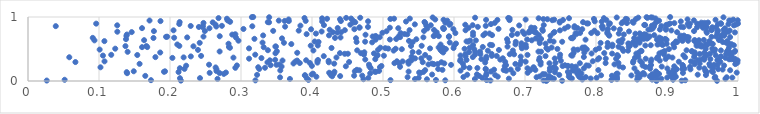
| Category | Series 0 |
|---|---|
| 0.7299349012485046 | 0.001 |
| 0.8851271148801086 | 0.002 |
| 0.9704446892895401 | 0.003 |
| 0.7522630521465085 | 0.004 |
| 0.9206481380586479 | 0.005 |
| 0.21533558743434872 | 0.006 |
| 0.026396326933418108 | 0.007 |
| 0.6513391772368835 | 0.008 |
| 0.7260594738416578 | 0.009 |
| 0.3202966401967571 | 0.01 |
| 0.5876682141787407 | 0.011 |
| 0.9257274416154958 | 0.012 |
| 0.17321469520273655 | 0.013 |
| 0.5105476472318626 | 0.014 |
| 0.645893604904842 | 0.015 |
| 0.5745877451959991 | 0.016 |
| 0.3949700723018088 | 0.017 |
| 0.8217753047264127 | 0.018 |
| 0.05161715156054727 | 0.019 |
| 0.9085060905664327 | 0.02 |
| 0.7317237979715445 | 0.021 |
| 0.8790770480540634 | 0.022 |
| 0.8580503356786545 | 0.023 |
| 0.7807825853209398 | 0.024 |
| 0.8867679921875168 | 0.025 |
| 0.7326063486481591 | 0.026 |
| 0.5618832442880827 | 0.027 |
| 0.47247400463420625 | 0.028 |
| 0.8295293481066721 | 0.029 |
| 0.5450958506525477 | 0.03 |
| 0.6294409682373789 | 0.031 |
| 0.3688950731030703 | 0.032 |
| 0.2669262019391956 | 0.033 |
| 0.8920140134834883 | 0.034 |
| 0.9823404318936501 | 0.035 |
| 0.740705699769862 | 0.036 |
| 0.677277720533834 | 0.037 |
| 0.7384435290794494 | 0.038 |
| 0.7925464789705889 | 0.039 |
| 0.7659609976045109 | 0.04 |
| 0.39270856272770227 | 0.041 |
| 0.8293403634217462 | 0.042 |
| 0.7812152879152522 | 0.043 |
| 0.21403520343330038 | 0.044 |
| 0.242246551091688 | 0.045 |
| 0.823674644437959 | 0.046 |
| 0.4792924608670494 | 0.047 |
| 0.6400161262003763 | 0.048 |
| 0.5502416499443968 | 0.049 |
| 0.8008211047687481 | 0.05 |
| 0.9671763706332107 | 0.051 |
| 0.7634456688116622 | 0.052 |
| 0.9920200841988499 | 0.053 |
| 0.9003204524386306 | 0.054 |
| 0.8611626668766535 | 0.055 |
| 0.7365337659491814 | 0.056 |
| 0.35503866398495726 | 0.057 |
| 0.9840582868963575 | 0.058 |
| 0.716318172759799 | 0.059 |
| 0.5346271771457493 | 0.06 |
| 0.7855856252759781 | 0.061 |
| 0.6132854470898765 | 0.062 |
| 0.7765765593028493 | 0.063 |
| 0.9679195542465351 | 0.064 |
| 0.9124521409534563 | 0.065 |
| 0.8294656088526974 | 0.066 |
| 0.40616311862784593 | 0.067 |
| 0.6616033069328324 | 0.068 |
| 0.7616928018792335 | 0.069 |
| 0.8585446357150388 | 0.07 |
| 0.8817077016365238 | 0.071 |
| 0.7207046953120136 | 0.072 |
| 0.8757414568585552 | 0.073 |
| 0.4283971444868982 | 0.074 |
| 0.7336017351095295 | 0.075 |
| 0.9114039719682651 | 0.076 |
| 0.4396665985323711 | 0.077 |
| 0.9056146824722616 | 0.078 |
| 0.6354101182015974 | 0.079 |
| 0.16519122051671808 | 0.08 |
| 0.9060413542827915 | 0.081 |
| 0.8225126723208137 | 0.082 |
| 0.4593364482381973 | 0.083 |
| 0.4707683890769927 | 0.084 |
| 0.7754020137651354 | 0.085 |
| 0.39055841115971873 | 0.086 |
| 0.8498432928704529 | 0.087 |
| 0.8857245384539948 | 0.088 |
| 0.8071369981865455 | 0.089 |
| 0.3899050201608162 | 0.09 |
| 0.6452632197534787 | 0.091 |
| 0.6580543698401828 | 0.092 |
| 0.9548141869132833 | 0.093 |
| 0.8787468571465591 | 0.094 |
| 0.7482520825225147 | 0.095 |
| 0.3226523432572018 | 0.096 |
| 0.426251314059735 | 0.097 |
| 0.6186308977875078 | 0.098 |
| 0.9432494454380806 | 0.099 |
| 0.8633617228847603 | 0.1 |
| 0.5692149259976328 | 0.101 |
| 0.399538127508098 | 0.102 |
| 0.8682703561659177 | 0.103 |
| 0.632310771430195 | 0.104 |
| 0.7280650453602969 | 0.105 |
| 0.4280295866738755 | 0.106 |
| 0.7251732574341322 | 0.107 |
| 0.879586658403317 | 0.108 |
| 0.7621104085858508 | 0.109 |
| 0.888797389631854 | 0.11 |
| 0.2758568390336391 | 0.111 |
| 0.8288372902590145 | 0.112 |
| 0.6457026406960731 | 0.113 |
| 0.40153956028942034 | 0.114 |
| 0.4306250741459417 | 0.115 |
| 0.8303071496463488 | 0.116 |
| 0.9102976181771898 | 0.117 |
| 0.7735892633275299 | 0.118 |
| 0.48195459948296643 | 0.119 |
| 0.779418482987507 | 0.12 |
| 0.6835557311774909 | 0.121 |
| 0.1395963485331204 | 0.122 |
| 0.2699761393912408 | 0.123 |
| 0.552522140016754 | 0.124 |
| 0.8665219889888859 | 0.125 |
| 0.922454421027908 | 0.126 |
| 0.2558834430971773 | 0.127 |
| 0.7037642814637972 | 0.128 |
| 0.42419358575693805 | 0.129 |
| 0.8859439583607438 | 0.13 |
| 0.9982000404380343 | 0.131 |
| 0.2787594572602362 | 0.132 |
| 0.5509227740310202 | 0.133 |
| 0.9557460459843845 | 0.134 |
| 0.9029450129447684 | 0.135 |
| 0.8578692040038169 | 0.136 |
| 0.7421848299285334 | 0.137 |
| 0.13902724682314754 | 0.138 |
| 0.9646508094372324 | 0.139 |
| 0.21204681032111702 | 0.14 |
| 0.5568887717798795 | 0.141 |
| 0.7604099413243516 | 0.142 |
| 0.4899129353735981 | 0.143 |
| 0.19152677247977284 | 0.144 |
| 0.43160581567873374 | 0.145 |
| 0.4884362994657613 | 0.146 |
| 0.536060970602131 | 0.147 |
| 0.6521857390019967 | 0.148 |
| 0.9089208796446411 | 0.149 |
| 0.8844055195411262 | 0.15 |
| 0.19299956908962046 | 0.151 |
| 0.1489348578616638 | 0.152 |
| 0.46032527454876626 | 0.153 |
| 0.9543114705460127 | 0.154 |
| 0.26549379586839655 | 0.155 |
| 0.9632539174173742 | 0.156 |
| 0.49444015525194146 | 0.157 |
| 0.7348004174487233 | 0.158 |
| 0.9543734406239085 | 0.159 |
| 0.7754701536575848 | 0.16 |
| 0.673752986138464 | 0.161 |
| 0.6092252808924444 | 0.162 |
| 0.7692983831820039 | 0.163 |
| 0.7668516608950096 | 0.164 |
| 0.35535463365680287 | 0.165 |
| 0.6723346508877919 | 0.166 |
| 0.4667228076091737 | 0.167 |
| 0.9889481622046089 | 0.168 |
| 0.7073626008594448 | 0.169 |
| 0.5594073512560157 | 0.17 |
| 0.8033089394796823 | 0.171 |
| 0.6700101581189098 | 0.172 |
| 0.7146028627760007 | 0.173 |
| 0.5837285530246301 | 0.174 |
| 0.46316941499904724 | 0.175 |
| 0.9091792256002911 | 0.176 |
| 0.6564362487742954 | 0.177 |
| 0.679860831337899 | 0.178 |
| 0.9783150435138863 | 0.179 |
| 0.26553357391323856 | 0.18 |
| 0.6447518275023574 | 0.181 |
| 0.9330069389213855 | 0.182 |
| 0.9135226526418838 | 0.183 |
| 0.9131437837940745 | 0.184 |
| 0.9720632677297083 | 0.185 |
| 0.9216642879680884 | 0.186 |
| 0.5777583974567733 | 0.187 |
| 0.32567367541740044 | 0.188 |
| 0.22038265762099093 | 0.189 |
| 0.6899128919758631 | 0.19 |
| 0.6445877059345456 | 0.191 |
| 0.8762765896607497 | 0.192 |
| 0.9245884243301037 | 0.193 |
| 0.7433996357024932 | 0.194 |
| 0.9005407479932556 | 0.195 |
| 0.9526851837386793 | 0.196 |
| 0.8541810626103278 | 0.197 |
| 0.7829065965119275 | 0.198 |
| 0.703564439801954 | 0.199 |
| 0.2139024808483259 | 0.2 |
| 0.7350872767028662 | 0.201 |
| 0.48266640304549735 | 0.202 |
| 0.6329361904369978 | 0.203 |
| 0.9649103463272508 | 0.204 |
| 0.621781160498361 | 0.205 |
| 0.2920124896675076 | 0.206 |
| 0.3338077493198002 | 0.207 |
| 0.7392789509276836 | 0.208 |
| 0.945502275553658 | 0.209 |
| 0.7121499635142886 | 0.21 |
| 0.8380428278899719 | 0.211 |
| 0.264283401639155 | 0.212 |
| 0.7120157224099088 | 0.213 |
| 0.10210518187968552 | 0.214 |
| 0.3242863908376798 | 0.215 |
| 0.49570513254337184 | 0.216 |
| 0.7414301301821857 | 0.217 |
| 0.6140531197021679 | 0.218 |
| 0.8696436997761189 | 0.219 |
| 0.922371414094233 | 0.22 |
| 0.9324761193262175 | 0.221 |
| 0.5240443324520808 | 0.222 |
| 0.8752970354976021 | 0.223 |
| 0.7715800381226685 | 0.224 |
| 0.8925976723867168 | 0.225 |
| 0.3571778530350089 | 0.226 |
| 0.4808708894969146 | 0.227 |
| 0.8329210235834568 | 0.228 |
| 0.9102116968895143 | 0.229 |
| 0.44765865101635544 | 0.23 |
| 0.7659349328918965 | 0.231 |
| 0.7604660703924303 | 0.232 |
| 0.6714570872303623 | 0.233 |
| 0.752900612482865 | 0.234 |
| 0.4978090354150115 | 0.235 |
| 0.39985060045669013 | 0.236 |
| 0.760444528823898 | 0.237 |
| 0.9605563549278331 | 0.238 |
| 0.22274959227623506 | 0.239 |
| 0.789787915995208 | 0.24 |
| 0.8656361788145678 | 0.241 |
| 0.9804140988451003 | 0.242 |
| 0.29423051753853996 | 0.243 |
| 0.7865090435358865 | 0.244 |
| 0.9222621246026126 | 0.245 |
| 0.7562938094465922 | 0.246 |
| 0.34176089383824115 | 0.247 |
| 0.6733163239055092 | 0.248 |
| 0.9217098832584106 | 0.249 |
| 0.8774934506588892 | 0.25 |
| 0.9711779924695619 | 0.251 |
| 0.5958604692592331 | 0.252 |
| 0.3499971239187729 | 0.253 |
| 0.9663482584339351 | 0.254 |
| 0.25499651727447464 | 0.255 |
| 0.4802844433443474 | 0.256 |
| 0.3543198186834152 | 0.257 |
| 0.721974701744977 | 0.258 |
| 0.564052724848175 | 0.259 |
| 0.8260316411721247 | 0.26 |
| 0.6929071415601735 | 0.261 |
| 0.9389673108541178 | 0.262 |
| 0.5717758500773974 | 0.263 |
| 0.996197251042208 | 0.264 |
| 0.5770202696448848 | 0.265 |
| 0.9597224147629014 | 0.266 |
| 0.6864445240796546 | 0.267 |
| 0.15717666585883144 | 0.268 |
| 0.6125648865352379 | 0.269 |
| 0.5360196501574012 | 0.27 |
| 0.4312654907846526 | 0.271 |
| 0.5690000106019761 | 0.272 |
| 0.9460233962198503 | 0.273 |
| 0.37390473742013497 | 0.274 |
| 0.5863509873978577 | 0.275 |
| 0.5226775743643451 | 0.276 |
| 0.734444362343775 | 0.277 |
| 0.7772499596229323 | 0.278 |
| 0.5160758800640529 | 0.279 |
| 0.8135352141266116 | 0.28 |
| 0.38276951081654725 | 0.281 |
| 0.8316078325340994 | 0.282 |
| 0.3969322018445183 | 0.283 |
| 0.7429186106753989 | 0.284 |
| 0.9991284606617038 | 0.285 |
| 0.8646463055684872 | 0.286 |
| 0.407668732881717 | 0.287 |
| 0.8521516388065578 | 0.288 |
| 0.6439271842378989 | 0.289 |
| 0.9386424394934456 | 0.29 |
| 0.33727827619289197 | 0.291 |
| 0.42363934833158984 | 0.292 |
| 0.5822587046875061 | 0.293 |
| 0.5559531647167948 | 0.294 |
| 0.7220737152622906 | 0.295 |
| 0.06678919427276907 | 0.296 |
| 0.45224833289362376 | 0.297 |
| 0.672089758725874 | 0.298 |
| 0.9751227041921605 | 0.299 |
| 0.5355681939726598 | 0.3 |
| 0.9166802658427137 | 0.301 |
| 0.7009202805344964 | 0.302 |
| 0.8771299370480814 | 0.303 |
| 0.37665568638622 | 0.304 |
| 0.9338540205523467 | 0.305 |
| 0.5276203354777987 | 0.306 |
| 0.10776525526559064 | 0.307 |
| 0.5195895749418272 | 0.308 |
| 0.795475706495293 | 0.309 |
| 0.5373851784798486 | 0.31 |
| 0.8623067517272001 | 0.311 |
| 0.8527391937421906 | 0.312 |
| 0.6946969484691551 | 0.313 |
| 0.608687845255619 | 0.314 |
| 0.42341042926690037 | 0.315 |
| 0.7504947263555529 | 0.316 |
| 0.40769286131649213 | 0.317 |
| 0.8898064710438512 | 0.318 |
| 0.379093937396039 | 0.319 |
| 0.3584665000238885 | 0.32 |
| 0.5400196871276911 | 0.321 |
| 0.9995050299462789 | 0.322 |
| 0.34065905787340717 | 0.323 |
| 0.39176105508055176 | 0.324 |
| 0.9430755954292708 | 0.325 |
| 0.9709386498142033 | 0.326 |
| 0.71981776320336 | 0.327 |
| 0.4084202582221832 | 0.328 |
| 0.6176254166167086 | 0.329 |
| 0.3481390926405603 | 0.33 |
| 0.9947881805474514 | 0.331 |
| 0.9467521153532958 | 0.332 |
| 0.952479570232433 | 0.333 |
| 0.6651780943391066 | 0.334 |
| 0.8780720966851113 | 0.335 |
| 0.47501546242308923 | 0.336 |
| 0.802494378942941 | 0.337 |
| 0.6092699954820116 | 0.338 |
| 0.9874861716087996 | 0.339 |
| 0.9904872248561752 | 0.34 |
| 0.4891170478344281 | 0.341 |
| 0.6386039171398435 | 0.342 |
| 0.9611007659987204 | 0.343 |
| 0.9959284930714946 | 0.344 |
| 0.8981006772544022 | 0.345 |
| 0.6452715712387914 | 0.346 |
| 0.8282941771669841 | 0.347 |
| 0.8700502980185509 | 0.348 |
| 0.3113693629051343 | 0.349 |
| 0.9519643327459899 | 0.35 |
| 0.813730319251143 | 0.351 |
| 0.7418847421017747 | 0.352 |
| 0.5451633127444908 | 0.353 |
| 0.5539700171668579 | 0.354 |
| 0.6688113324484243 | 0.355 |
| 0.885744734807609 | 0.356 |
| 0.8043173510926154 | 0.357 |
| 0.3287882608478278 | 0.358 |
| 0.720490080542567 | 0.359 |
| 0.5651416728669952 | 0.36 |
| 0.2034267319438599 | 0.361 |
| 0.982279595302334 | 0.362 |
| 0.8548589797190452 | 0.363 |
| 0.9520972881215761 | 0.364 |
| 0.289331307944807 | 0.365 |
| 0.9076381182871138 | 0.366 |
| 0.43443203213605214 | 0.367 |
| 0.9743954095420346 | 0.368 |
| 0.21921143052138464 | 0.369 |
| 0.9255152501051025 | 0.37 |
| 0.05816458843759448 | 0.371 |
| 0.7489248394642068 | 0.372 |
| 0.17944386950998117 | 0.373 |
| 0.6265179335107016 | 0.374 |
| 0.7829006822567032 | 0.375 |
| 0.9382279000409094 | 0.376 |
| 0.8874464581196302 | 0.377 |
| 0.8596105343814744 | 0.378 |
| 0.6454810603351194 | 0.379 |
| 0.5402799369123956 | 0.38 |
| 0.6939624325313156 | 0.381 |
| 0.9022419148514357 | 0.382 |
| 0.8305782608286554 | 0.383 |
| 0.2293173308225781 | 0.384 |
| 0.9761515607118132 | 0.385 |
| 0.6162878198461711 | 0.386 |
| 0.9906816689982072 | 0.387 |
| 0.4165711824719343 | 0.388 |
| 0.7289270263022282 | 0.389 |
| 0.8308998501196416 | 0.39 |
| 0.6601587468650547 | 0.391 |
| 0.2438159594639094 | 0.392 |
| 0.6532412771416897 | 0.393 |
| 0.49145489523743185 | 0.394 |
| 0.5012681165038301 | 0.395 |
| 0.7667778221194552 | 0.396 |
| 0.10557506898761307 | 0.397 |
| 0.955868049029564 | 0.398 |
| 0.6091788263827813 | 0.399 |
| 0.9686454186452288 | 0.4 |
| 0.7651387883280075 | 0.401 |
| 0.9230693169050526 | 0.402 |
| 0.4924293344450868 | 0.403 |
| 0.9907978518114712 | 0.404 |
| 0.8299136539034125 | 0.405 |
| 0.1539379660810887 | 0.406 |
| 0.5593755457074561 | 0.407 |
| 0.7035680450542635 | 0.408 |
| 0.11724293540098071 | 0.409 |
| 0.9390512804998342 | 0.41 |
| 0.32006610312929445 | 0.411 |
| 0.7494421894626285 | 0.412 |
| 0.6297085089835688 | 0.413 |
| 0.47321296285445114 | 0.414 |
| 0.8958912270119712 | 0.415 |
| 0.9879885696550272 | 0.416 |
| 0.6846549495564057 | 0.417 |
| 0.6785216136310086 | 0.418 |
| 0.6161112221360023 | 0.419 |
| 0.6370628197392177 | 0.42 |
| 0.983335030497652 | 0.421 |
| 0.9460555254592153 | 0.422 |
| 0.9544060323187245 | 0.423 |
| 0.6529417863351357 | 0.424 |
| 0.4460932859728349 | 0.425 |
| 0.450527394631332 | 0.426 |
| 0.9606767975579985 | 0.427 |
| 0.8227191225704872 | 0.428 |
| 0.8568204910057063 | 0.429 |
| 0.7937708503504765 | 0.43 |
| 0.48725310320467474 | 0.431 |
| 0.8893098698747193 | 0.432 |
| 0.3485426526743183 | 0.433 |
| 0.4690436612010344 | 0.434 |
| 0.43939118537751376 | 0.435 |
| 0.811628391329599 | 0.436 |
| 0.9521617471049109 | 0.437 |
| 0.6827598732291853 | 0.438 |
| 0.7685356545536436 | 0.439 |
| 0.9903994099278961 | 0.44 |
| 0.3791756763164793 | 0.441 |
| 0.8947434479064678 | 0.442 |
| 0.783516265027248 | 0.443 |
| 0.8604547615174348 | 0.444 |
| 0.18625158867835845 | 0.445 |
| 0.5848737607875252 | 0.446 |
| 0.8926397872406203 | 0.447 |
| 0.9389938858079866 | 0.448 |
| 0.47369296308320646 | 0.449 |
| 0.5505205497826513 | 0.45 |
| 0.6211912557804359 | 0.451 |
| 0.5417051538321924 | 0.452 |
| 0.9860037547839008 | 0.453 |
| 0.6298948377779218 | 0.454 |
| 0.9950546363702137 | 0.455 |
| 0.14032589937880097 | 0.456 |
| 0.9841460291448214 | 0.457 |
| 0.7226275115719325 | 0.458 |
| 0.6366513638304702 | 0.459 |
| 0.7189681111181883 | 0.46 |
| 0.2699303399418545 | 0.461 |
| 0.966730496332216 | 0.462 |
| 0.5829209792599623 | 0.463 |
| 0.9348508668373081 | 0.464 |
| 0.3505034480083949 | 0.465 |
| 0.9352116247445278 | 0.466 |
| 0.8640960205523787 | 0.467 |
| 0.9858021311164091 | 0.468 |
| 0.8965099925047326 | 0.469 |
| 0.9958798615908805 | 0.47 |
| 0.8385284259234769 | 0.471 |
| 0.8634048470447767 | 0.472 |
| 0.6476956504012643 | 0.473 |
| 0.8451527904686426 | 0.474 |
| 0.5149564745075845 | 0.475 |
| 0.6829285167091297 | 0.476 |
| 0.4019544831414228 | 0.477 |
| 0.9759586790061011 | 0.478 |
| 0.4636868175332268 | 0.479 |
| 0.9275465093005779 | 0.48 |
| 0.3378927171195604 | 0.481 |
| 0.9857494173996997 | 0.482 |
| 0.9655599970819776 | 0.483 |
| 0.581015371931692 | 0.484 |
| 0.6632915777704959 | 0.485 |
| 0.23938034262962748 | 0.486 |
| 0.4930318052196599 | 0.487 |
| 0.7995807059541895 | 0.488 |
| 0.7743060953656792 | 0.489 |
| 0.7322855058685486 | 0.49 |
| 0.10093392988721615 | 0.491 |
| 0.9676323693531045 | 0.492 |
| 0.9651032961102014 | 0.493 |
| 0.7685848334697148 | 0.494 |
| 0.7870055637459522 | 0.495 |
| 0.6285857507065662 | 0.496 |
| 0.5265102337219681 | 0.497 |
| 0.9027373455633438 | 0.498 |
| 0.5885478471173962 | 0.499 |
| 0.9544854761890362 | 0.5 |
| 0.7456908128354649 | 0.501 |
| 0.8368556669737859 | 0.502 |
| 0.6148946609181769 | 0.503 |
| 0.5178421970746745 | 0.504 |
| 0.12286642293139831 | 0.505 |
| 0.5073227183754226 | 0.506 |
| 0.9637960099875725 | 0.507 |
| 0.7812222997058877 | 0.508 |
| 0.5662663475086878 | 0.509 |
| 0.3112883198539979 | 0.51 |
| 0.6956617931005683 | 0.511 |
| 0.8043634438212466 | 0.512 |
| 0.5032002026203906 | 0.513 |
| 0.7301107090930273 | 0.514 |
| 0.5993824230017883 | 0.515 |
| 0.4275189292348898 | 0.516 |
| 0.5851309205500891 | 0.517 |
| 0.6219657418446708 | 0.518 |
| 0.28445053700574957 | 0.519 |
| 0.9872810701290637 | 0.52 |
| 0.4962653109623832 | 0.521 |
| 0.7809224243160356 | 0.522 |
| 0.7375232063345979 | 0.523 |
| 0.5783634669721739 | 0.524 |
| 0.7840372223400254 | 0.525 |
| 0.701637283707482 | 0.526 |
| 0.9099939450889012 | 0.527 |
| 0.33198214504858425 | 0.528 |
| 0.16063606769370248 | 0.529 |
| 0.16794490870312215 | 0.53 |
| 0.2830726470946112 | 0.531 |
| 0.6405453520659802 | 0.532 |
| 0.8161914911427903 | 0.533 |
| 0.8460531446997641 | 0.534 |
| 0.8317337032136969 | 0.535 |
| 0.5810449553852597 | 0.536 |
| 0.6753791650902973 | 0.537 |
| 0.3491517864024187 | 0.538 |
| 0.34842604982631264 | 0.539 |
| 0.9480928891414204 | 0.54 |
| 0.9492550065666749 | 0.541 |
| 0.23300042869523546 | 0.542 |
| 0.8228952350157546 | 0.543 |
| 0.6950559860911916 | 0.544 |
| 0.13724384916349752 | 0.545 |
| 0.16668382487953926 | 0.546 |
| 0.5394863420445678 | 0.547 |
| 0.21315380034669437 | 0.548 |
| 0.8477331131615641 | 0.549 |
| 0.5544760688621365 | 0.55 |
| 0.9416675245704174 | 0.551 |
| 0.398238084704079 | 0.552 |
| 0.9447509166564727 | 0.553 |
| 0.869509448003076 | 0.554 |
| 0.40813866100812524 | 0.555 |
| 0.6003696808223458 | 0.556 |
| 0.8555653502119315 | 0.557 |
| 0.9942220935615819 | 0.558 |
| 0.8771529437794962 | 0.559 |
| 0.6537241670883683 | 0.56 |
| 0.6268240715337299 | 0.561 |
| 0.8938171876895841 | 0.562 |
| 0.9565605675075236 | 0.563 |
| 0.9877199079733474 | 0.564 |
| 0.6508568291711365 | 0.565 |
| 0.7010262764284704 | 0.566 |
| 0.9475778841633766 | 0.567 |
| 0.8231756285381887 | 0.568 |
| 0.8865652024376169 | 0.569 |
| 0.5811212275743481 | 0.57 |
| 0.2102770779736634 | 0.571 |
| 0.9095491183822126 | 0.572 |
| 0.6866093709466902 | 0.573 |
| 0.9543421407162894 | 0.574 |
| 0.8465511555582031 | 0.575 |
| 0.990691116755176 | 0.576 |
| 0.37086595947101175 | 0.577 |
| 0.9089670778895521 | 0.578 |
| 0.9644905282377687 | 0.579 |
| 0.888254871027823 | 0.58 |
| 0.8995024922702577 | 0.581 |
| 0.28244146184232044 | 0.582 |
| 0.7289099499630896 | 0.583 |
| 0.8918328178137164 | 0.584 |
| 0.6027944720598962 | 0.585 |
| 0.9415924262973228 | 0.586 |
| 0.8455135704258551 | 0.587 |
| 0.9864625155846977 | 0.588 |
| 0.6950441026283598 | 0.589 |
| 0.8549411819635743 | 0.59 |
| 0.9618890696240738 | 0.591 |
| 0.7207634696643758 | 0.592 |
| 0.9428721633497693 | 0.593 |
| 0.8163768284983616 | 0.594 |
| 0.8065104917439686 | 0.595 |
| 0.24184404192845105 | 0.596 |
| 0.36048094965352706 | 0.597 |
| 0.9832862449285908 | 0.598 |
| 0.8613567911971728 | 0.599 |
| 0.33033708817997337 | 0.6 |
| 0.5940434774595313 | 0.601 |
| 0.8358375206126121 | 0.602 |
| 0.8520828263596272 | 0.603 |
| 0.4847287464676723 | 0.604 |
| 0.8900680866404678 | 0.605 |
| 0.6757321927968115 | 0.606 |
| 0.5418065818786366 | 0.607 |
| 0.914168762469705 | 0.608 |
| 0.9786288614231002 | 0.609 |
| 0.4627975780616167 | 0.61 |
| 0.4092409989354439 | 0.611 |
| 0.6869928587778849 | 0.612 |
| 0.7523671407741306 | 0.613 |
| 0.47484842809293093 | 0.614 |
| 0.6201543728039943 | 0.615 |
| 0.7402747633120819 | 0.616 |
| 0.4038284455514661 | 0.617 |
| 0.9126014623137012 | 0.618 |
| 0.6176677766695517 | 0.619 |
| 0.834207205237204 | 0.62 |
| 0.8319767886583366 | 0.621 |
| 0.9596719114088533 | 0.622 |
| 0.1075936577411176 | 0.623 |
| 0.9849893739101971 | 0.624 |
| 0.8920824773004258 | 0.625 |
| 0.5365868782251934 | 0.626 |
| 0.9218786830736394 | 0.627 |
| 0.9297938537807121 | 0.628 |
| 0.9383340905422481 | 0.629 |
| 0.29642496751291614 | 0.63 |
| 0.7351507698470449 | 0.631 |
| 0.6226645063225276 | 0.632 |
| 0.7202891362692919 | 0.633 |
| 0.6308190160926296 | 0.634 |
| 0.09363549611014306 | 0.635 |
| 0.7094974955760812 | 0.636 |
| 0.9450086493798161 | 0.637 |
| 0.1635547381193012 | 0.638 |
| 0.939146259146052 | 0.639 |
| 0.9732058122246583 | 0.64 |
| 0.9211541368836139 | 0.641 |
| 0.951922481443712 | 0.642 |
| 0.8994600585243012 | 0.643 |
| 0.8592185494232483 | 0.644 |
| 0.4895473234584674 | 0.645 |
| 0.7852663208500605 | 0.646 |
| 0.8858413139251036 | 0.647 |
| 0.5097077247014435 | 0.648 |
| 0.7030953288008941 | 0.649 |
| 0.9749376076276436 | 0.65 |
| 0.8373170934716775 | 0.651 |
| 0.5469577242269168 | 0.652 |
| 0.6747320552263402 | 0.653 |
| 0.138019436797292 | 0.654 |
| 0.8595959483335743 | 0.655 |
| 0.5185880780732361 | 0.656 |
| 0.7226763291051246 | 0.657 |
| 0.8973400701837345 | 0.658 |
| 0.3189365781743962 | 0.659 |
| 0.8675440399318455 | 0.66 |
| 0.8639227034009321 | 0.661 |
| 0.8715827471606743 | 0.662 |
| 0.86563305746796 | 0.663 |
| 0.8917514349316533 | 0.664 |
| 0.7150555110712715 | 0.665 |
| 0.3577505777690223 | 0.666 |
| 0.766937815476249 | 0.667 |
| 0.4619770365408504 | 0.668 |
| 0.8729603999359462 | 0.669 |
| 0.8538197961248686 | 0.67 |
| 0.7649734854632698 | 0.671 |
| 0.17671337153849115 | 0.672 |
| 0.4324103163180772 | 0.673 |
| 0.09121252595322664 | 0.674 |
| 0.9184927472334891 | 0.675 |
| 0.20583495481346292 | 0.676 |
| 0.9259237872222502 | 0.677 |
| 0.8891510006155465 | 0.678 |
| 0.2929526718468302 | 0.679 |
| 0.4401737643921263 | 0.68 |
| 0.2242211989174311 | 0.681 |
| 0.5568780638500228 | 0.682 |
| 0.9304424746881893 | 0.683 |
| 0.495404967986544 | 0.684 |
| 0.5240706728342802 | 0.685 |
| 0.988878811396272 | 0.686 |
| 0.92825200316015 | 0.687 |
| 0.7682678526940815 | 0.688 |
| 0.5927907302542443 | 0.689 |
| 0.19443449741103733 | 0.69 |
| 0.962802881796435 | 0.691 |
| 0.19607281365109716 | 0.692 |
| 0.8636986141928903 | 0.693 |
| 0.24715200779150745 | 0.694 |
| 0.9692343954915364 | 0.695 |
| 0.4854168340009777 | 0.696 |
| 0.8756739124672753 | 0.697 |
| 0.5221169881133403 | 0.698 |
| 0.5929544551237361 | 0.699 |
| 0.2700370040277443 | 0.7 |
| 0.5785684044992104 | 0.701 |
| 0.5714364518254632 | 0.702 |
| 0.9762810643749911 | 0.703 |
| 0.48978057071920594 | 0.704 |
| 0.13860140767962278 | 0.705 |
| 0.7358028473506996 | 0.706 |
| 0.9804854783008025 | 0.707 |
| 0.8186647167458857 | 0.708 |
| 0.919020723843762 | 0.709 |
| 0.9238513173356063 | 0.71 |
| 0.5726522393948305 | 0.711 |
| 0.33119408176064696 | 0.712 |
| 0.4239477325252802 | 0.713 |
| 0.6268044934850155 | 0.714 |
| 0.6413496001203413 | 0.715 |
| 0.8821012816442996 | 0.716 |
| 0.6536391149329601 | 0.717 |
| 0.7193414061802892 | 0.718 |
| 0.6815334513556442 | 0.719 |
| 0.8642352016746392 | 0.72 |
| 0.8705113718932976 | 0.721 |
| 0.29042252341935415 | 0.722 |
| 0.47539546498989327 | 0.723 |
| 0.8177564321876662 | 0.724 |
| 0.28765415333128025 | 0.725 |
| 0.13929816294305197 | 0.726 |
| 0.8392198750922234 | 0.727 |
| 0.9806974943459467 | 0.728 |
| 0.5342799907361399 | 0.729 |
| 0.29208582349005 | 0.73 |
| 0.8681946867636742 | 0.731 |
| 0.3924178232523664 | 0.732 |
| 0.9791507295882632 | 0.733 |
| 0.5303767192478888 | 0.734 |
| 0.6990867069899015 | 0.735 |
| 0.7727841233220821 | 0.736 |
| 0.6891396771089358 | 0.737 |
| 0.9708701097418801 | 0.738 |
| 0.8555090989199264 | 0.739 |
| 0.8321113133404401 | 0.74 |
| 0.4055216515341207 | 0.741 |
| 0.6499822786209958 | 0.742 |
| 0.6441784266574213 | 0.743 |
| 0.8616309998859625 | 0.744 |
| 0.7711987768723939 | 0.745 |
| 0.8158953604875395 | 0.746 |
| 0.8019783083315473 | 0.747 |
| 0.5249340784924156 | 0.748 |
| 0.6019361090348189 | 0.749 |
| 0.7933369435970735 | 0.75 |
| 0.7776186831865519 | 0.751 |
| 0.7401814637703173 | 0.752 |
| 0.4991551809675639 | 0.753 |
| 0.9560918254471985 | 0.754 |
| 0.6267907477834421 | 0.755 |
| 0.715421624903791 | 0.756 |
| 0.43556744637034883 | 0.757 |
| 0.7048822666523664 | 0.758 |
| 0.9956275469741928 | 0.759 |
| 0.5756508378328974 | 0.76 |
| 0.42941616732566495 | 0.761 |
| 0.44093112767174353 | 0.762 |
| 0.9141667785478255 | 0.763 |
| 0.1460697414864954 | 0.764 |
| 0.7066750821618595 | 0.765 |
| 0.7414858403771772 | 0.766 |
| 0.8161291335156279 | 0.767 |
| 0.713171720435347 | 0.768 |
| 0.9863514954877681 | 0.769 |
| 0.1258260797520428 | 0.77 |
| 0.9711097686595836 | 0.771 |
| 0.6966142135967429 | 0.772 |
| 0.41357163395605306 | 0.773 |
| 0.9836836882837866 | 0.774 |
| 0.846491988166547 | 0.775 |
| 0.7127297731973791 | 0.776 |
| 0.5049757476379197 | 0.777 |
| 0.955482997733325 | 0.778 |
| 0.17736566863431752 | 0.779 |
| 0.9380682052042506 | 0.78 |
| 0.24911548840281006 | 0.781 |
| 0.5578489201883549 | 0.782 |
| 0.3453393184147553 | 0.783 |
| 0.7250953952281817 | 0.784 |
| 0.7070022419172146 | 0.785 |
| 0.797753388892624 | 0.786 |
| 0.3812799814125691 | 0.787 |
| 0.9716527158201371 | 0.788 |
| 0.9882906458389173 | 0.789 |
| 0.9061247816373701 | 0.79 |
| 0.7492350532989118 | 0.791 |
| 0.20496978359014198 | 0.792 |
| 0.6162599957938404 | 0.793 |
| 0.44624133229958823 | 0.794 |
| 0.5373954666198809 | 0.795 |
| 0.9625590166467423 | 0.796 |
| 0.57192454140322 | 0.797 |
| 0.9796520181731119 | 0.798 |
| 0.6822663187655462 | 0.799 |
| 0.9632270565935019 | 0.8 |
| 0.42491545873181236 | 0.801 |
| 0.8983435242039275 | 0.802 |
| 0.8738019000928929 | 0.803 |
| 0.8900364603629335 | 0.804 |
| 0.8337181105506717 | 0.805 |
| 0.7243729430939327 | 0.806 |
| 0.8772230374610928 | 0.807 |
| 0.39873455248883 | 0.808 |
| 0.45968105849034224 | 0.809 |
| 0.7805935183892125 | 0.81 |
| 0.5991029593369347 | 0.811 |
| 0.8167290933161201 | 0.812 |
| 0.30349682858221183 | 0.813 |
| 0.5852014997617765 | 0.814 |
| 0.6627025670942135 | 0.815 |
| 0.5859208826441731 | 0.816 |
| 0.8983772977763336 | 0.817 |
| 0.8093929992175551 | 0.818 |
| 0.8797646995274576 | 0.819 |
| 0.755882705825115 | 0.82 |
| 0.5625883247852013 | 0.821 |
| 0.8250278140710354 | 0.822 |
| 0.9816505849440911 | 0.823 |
| 0.25555870110564577 | 0.824 |
| 0.521535574084279 | 0.825 |
| 0.16059430798013277 | 0.826 |
| 0.7738822652491779 | 0.827 |
| 0.43619584492458835 | 0.828 |
| 0.7134396633348599 | 0.829 |
| 0.5846599384229947 | 0.83 |
| 0.6205099956647502 | 0.831 |
| 0.9505922269610629 | 0.832 |
| 0.5096345816447125 | 0.833 |
| 0.46679808992986843 | 0.834 |
| 0.7087327806213577 | 0.835 |
| 0.7695667880313423 | 0.836 |
| 0.46696296089964817 | 0.837 |
| 0.9422468632761449 | 0.838 |
| 0.9692546024631349 | 0.839 |
| 0.9638307083399059 | 0.84 |
| 0.9230102360783159 | 0.841 |
| 0.2459053382160487 | 0.842 |
| 0.9559365041562631 | 0.843 |
| 0.2406782694269463 | 0.844 |
| 0.4788612372131763 | 0.845 |
| 0.6335572251993863 | 0.846 |
| 0.9195687812736004 | 0.847 |
| 0.7605597134821867 | 0.848 |
| 0.3621285012992487 | 0.849 |
| 0.8081971039422575 | 0.85 |
| 0.26524299761059844 | 0.851 |
| 0.8816409352170967 | 0.852 |
| 0.8093636804257299 | 0.853 |
| 0.9311527895001868 | 0.854 |
| 0.31592003972227356 | 0.855 |
| 0.7697470719954574 | 0.856 |
| 0.03910885327053008 | 0.857 |
| 0.8919699842446775 | 0.858 |
| 0.24628106607192274 | 0.859 |
| 0.2291564469055512 | 0.86 |
| 0.6446997295890814 | 0.861 |
| 0.2731036017564959 | 0.862 |
| 0.5609628950227808 | 0.863 |
| 0.8785865810632812 | 0.864 |
| 0.38368703471287235 | 0.865 |
| 0.9534505197186935 | 0.866 |
| 0.9485794814579394 | 0.867 |
| 0.6918311696818659 | 0.868 |
| 0.9942065489044496 | 0.869 |
| 0.1256790570245523 | 0.87 |
| 0.5672872923231073 | 0.871 |
| 0.626257136837656 | 0.872 |
| 0.4168272845459312 | 0.873 |
| 0.7264020873801508 | 0.874 |
| 0.8691598233069625 | 0.875 |
| 0.8679917944904064 | 0.876 |
| 0.8988619027040883 | 0.877 |
| 0.5936746038942391 | 0.878 |
| 0.6158757461732449 | 0.879 |
| 0.45399647399290805 | 0.88 |
| 0.9968546546948595 | 0.881 |
| 0.2640266272679537 | 0.882 |
| 0.9016977870609194 | 0.883 |
| 0.8182369519497701 | 0.884 |
| 0.5448456348187208 | 0.885 |
| 0.8822300637254045 | 0.886 |
| 0.971766815953611 | 0.887 |
| 0.9865141728647764 | 0.888 |
| 0.6520511576881148 | 0.889 |
| 0.21306451978670135 | 0.89 |
| 0.929273802983246 | 0.891 |
| 0.932237901288314 | 0.892 |
| 0.5947947358411962 | 0.893 |
| 0.9762243869841893 | 0.894 |
| 0.9424851804423469 | 0.895 |
| 0.09603209380290578 | 0.896 |
| 0.9999763592625929 | 0.897 |
| 0.9042576647317967 | 0.898 |
| 0.7889752195597614 | 0.899 |
| 0.7869496569989056 | 0.9 |
| 0.8195723513959137 | 0.901 |
| 0.9756018005242545 | 0.902 |
| 0.8362444635125503 | 0.903 |
| 0.910375272393157 | 0.904 |
| 0.8435985997306907 | 0.905 |
| 0.5595266989580023 | 0.906 |
| 0.24719111058841217 | 0.907 |
| 0.6573866737992426 | 0.908 |
| 0.9528538020130229 | 0.909 |
| 0.8527675409584375 | 0.91 |
| 0.5878343940334658 | 0.911 |
| 0.9483852074806423 | 0.912 |
| 0.7488947848245168 | 0.913 |
| 0.9577494207816785 | 0.914 |
| 0.4580949320983637 | 0.915 |
| 0.26017384105197755 | 0.916 |
| 0.33954564564255985 | 0.917 |
| 0.4609312154118032 | 0.918 |
| 0.7817249310601447 | 0.919 |
| 0.3377794712074421 | 0.92 |
| 0.2135815867022527 | 0.921 |
| 0.5584244234224724 | 0.922 |
| 0.8850754481249377 | 0.923 |
| 0.8381432434415795 | 0.924 |
| 0.2847081176733026 | 0.925 |
| 0.8514228388210159 | 0.926 |
| 0.8080313283500673 | 0.927 |
| 0.7491506950799269 | 0.928 |
| 0.5324123674115294 | 0.929 |
| 0.41430197773551464 | 0.93 |
| 0.9194449385372453 | 0.931 |
| 0.7982155807175977 | 0.932 |
| 0.47897900329894233 | 0.933 |
| 0.2834869017029231 | 0.934 |
| 0.36730134867430836 | 0.935 |
| 0.18661742636886777 | 0.936 |
| 0.44067386100950257 | 0.937 |
| 0.3615027617787929 | 0.938 |
| 0.39109119568678236 | 0.939 |
| 0.4580355958743301 | 0.94 |
| 0.8888469650900862 | 0.941 |
| 0.9898444573241907 | 0.942 |
| 0.5906412850425964 | 0.943 |
| 0.35322113007740125 | 0.944 |
| 0.17118655443585906 | 0.945 |
| 0.987670322538242 | 0.946 |
| 0.9378673077402625 | 0.947 |
| 0.2810083935346772 | 0.948 |
| 0.9996428407387971 | 0.949 |
| 0.7383440904156815 | 0.95 |
| 0.6781481640255662 | 0.951 |
| 0.8146436286499597 | 0.952 |
| 0.7535292923364035 | 0.953 |
| 0.6611156824475639 | 0.954 |
| 0.6452041401300456 | 0.955 |
| 0.9683777158204379 | 0.956 |
| 0.5852976761155781 | 0.957 |
| 0.7412770308606446 | 0.958 |
| 0.9933839400523958 | 0.959 |
| 0.7009224836267635 | 0.96 |
| 0.5735621043284865 | 0.961 |
| 0.3670679775501594 | 0.962 |
| 0.9289085976084095 | 0.963 |
| 0.8439211846722771 | 0.964 |
| 0.7314656422663944 | 0.965 |
| 0.4394268976193356 | 0.966 |
| 0.7259247509026668 | 0.967 |
| 0.8562427592968244 | 0.968 |
| 0.5104143845254664 | 0.969 |
| 0.7970760920407652 | 0.97 |
| 0.8419528568290323 | 0.971 |
| 0.42122083249461423 | 0.972 |
| 0.28020987748789944 | 0.973 |
| 0.5155935378049813 | 0.974 |
| 0.537780696684495 | 0.975 |
| 0.45511092214993026 | 0.976 |
| 0.8839011593537844 | 0.977 |
| 0.678349103573694 | 0.978 |
| 0.41423758226455426 | 0.979 |
| 0.7191898900031045 | 0.98 |
| 0.7619971895553976 | 0.981 |
| 0.8111152522052363 | 0.982 |
| 0.2683528702401359 | 0.983 |
| 0.3894186487209384 | 0.984 |
| 0.6763954821673915 | 0.985 |
| 0.44809794620350274 | 0.986 |
| 0.8723952348949655 | 0.987 |
| 0.4679315442640416 | 0.988 |
| 0.629724993345498 | 0.989 |
| 0.8595585230661291 | 0.99 |
| 0.8796698971502059 | 0.991 |
| 0.8292031594480803 | 0.992 |
| 0.5699814736146981 | 0.993 |
| 0.8774999974000487 | 0.994 |
| 0.9795084842283527 | 0.995 |
| 0.33967281870734267 | 0.996 |
| 0.8712018691227471 | 0.997 |
| 0.31535892715095193 | 0.998 |
| 0.9044534923460548 | 0.999 |
| 0.31722056824076106 | 1 |